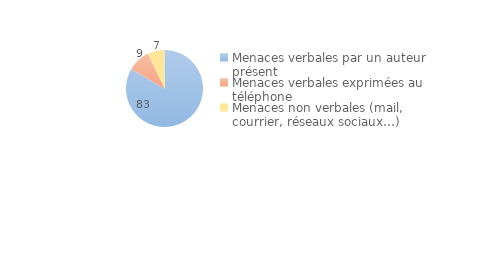
| Category | Series 0 |
|---|---|
| Menaces verbales par un auteur présent | 83.285 |
| Menaces verbales exprimées au téléphone | 9.471 |
| Menaces non verbales (mail, courrier, réseaux sociaux…) | 7.088 |